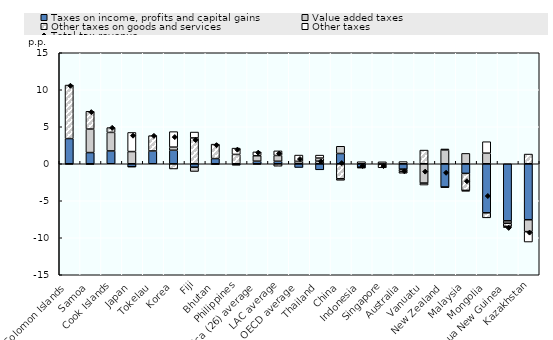
| Category | Taxes on income, profits and capital gains | Value added taxes | Other taxes on goods and services | Other taxes |
|---|---|---|---|---|
| Solomon Islands | 3.404 | 0 | 7.231 | -0.065 |
| Samoa | 1.511 | 3.178 | 2.407 | -0.092 |
| Cook Islands | 1.733 | 2.503 | 0.648 | 0 |
| Japan | -0.397 | 1.645 | -0.009 | 2.586 |
| Tokelau | 1.73 | 0 | 2.07 | 0 |
| Korea | 1.822 | 0.422 | -0.705 | 2.097 |
| Fiji | -0.464 | -0.58 | 3.491 | 0.794 |
| Bhutan | 0.7 | 0 | 1.952 | -0.108 |
| Philippines | -0.124 | -0.049 | 1.259 | 0.854 |
| Africa (26) average | 0.348 | 0.738 | -0.074 | 0.52 |
| LAC average | 0.337 | 0.78 | -0.332 | 0.625 |
| OECD average | -0.503 | 0.312 | 0.014 | 0.848 |
| Thailand | -0.817 | 0.35 | 0.417 | 0.4 |
| China | 1.386 | 0.977 | -2.037 | -0.203 |
| Indonesia | -0.461 | -0.067 | -0.015 | 0.276 |
| Singapore | 0.027 | -0.048 | -0.498 | 0.238 |
| Australia | -0.729 | -0.303 | -0.249 | 0.293 |
| Vanuatu | 0 | -2.612 | 1.848 | -0.266 |
| New Zealand | -3.159 | 1.867 | -0.03 | 0.132 |
| Malaysia | -1.304 | 1.399 | -2.3 | -0.121 |
| Mongolia | -6.632 | 1.428 | -0.678 | 1.554 |
| Papua New Guinea | -7.714 | -0.321 | -0.419 | -0.176 |
| Kazakhstan | -7.565 | -1.606 | 1.311 | -1.408 |